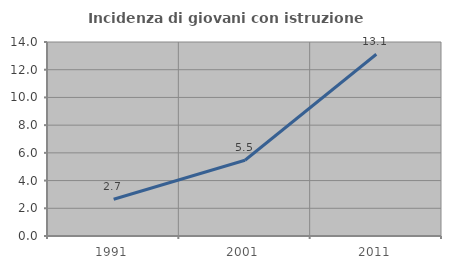
| Category | Incidenza di giovani con istruzione universitaria |
|---|---|
| 1991.0 | 2.655 |
| 2001.0 | 5.469 |
| 2011.0 | 13.115 |